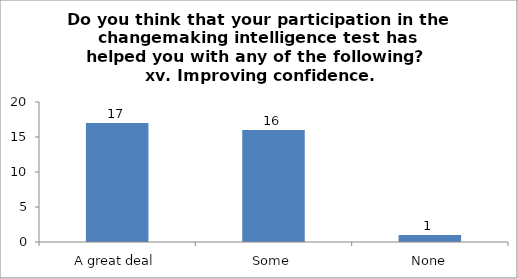
| Category | Do you think that your participation in the changemaking intelligence test has helped you with any of the following? 
 xv. Improving confidence. |
|---|---|
| A great deal | 17 |
| Some | 16 |
| None | 1 |